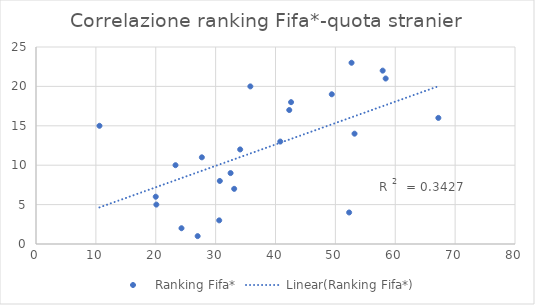
| Category | Ranking Fifa* |
|---|---|
| 52.7 | 23 |
| 57.9 | 22 |
| 58.4 | 21 |
| 42.6 | 18 |
| 49.4 | 19 |
| 67.2 | 16 |
| 42.3 | 17 |
| 53.2 | 14 |
| 35.8 | 20 |
| 23.3 | 10 |
| 27.7 | 11 |
| 40.8 | 13 |
| 30.6 | 3 |
| 32.5 | 9 |
| 30.7 | 8 |
| 33.1 | 7 |
| 20.1 | 5 |
| 20.0 | 6 |
| 24.3 | 2 |
| 10.6 | 15 |
| 34.1 | 12 |
| 27.0 | 1 |
| 52.3 | 4 |